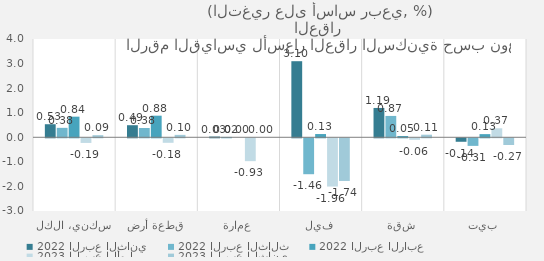
| Category | 2022 | 2023 |
|---|---|---|
| سكني، الكل | 0.839 | 0.086 |
| قطعة أرض | 0.879 | 0.098 |
| عمارة | 0 | 0 |
| فيلا | 0.132 | -1.737 |
| شقة | 0.053 | 0.106 |
| بيت | 0.128 | -0.274 |